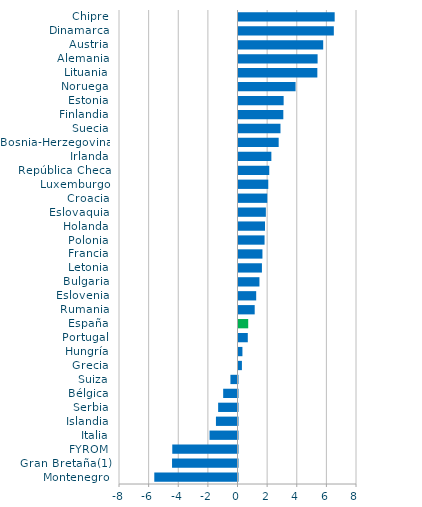
| Category | Series 0 |
|---|---|
| Montenegro | -5.617 |
| Gran Bretaña(1) | -4.419 |
| FYROM | -4.404 |
| Italia | -1.887 |
| Islandia | -1.456 |
| Serbia | -1.307 |
| Bélgica | -0.967 |
| Suiza | -0.478 |
| Grecia | 0.231 |
| Hungría | 0.265 |
| Portugal | 0.627 |
| España | 0.656 |
| Rumania | 1.093 |
| Eslovenia | 1.194 |
| Bulgaria | 1.414 |
| Letonia | 1.581 |
| Francia | 1.616 |
| Polonia | 1.759 |
| Holanda | 1.791 |
| Eslovaquia | 1.847 |
| Croacia | 1.943 |
| Luxemburgo | 2.01 |
| República Checa | 2.077 |
| Irlanda | 2.218 |
| Bosnia-Herzegovina | 2.712 |
| Suecia | 2.834 |
| Finlandia | 3.026 |
| Estonia | 3.047 |
| Noruega | 3.853 |
| Lituania | 5.323 |
| Alemania | 5.34 |
| Austria | 5.718 |
| Dinamarca | 6.435 |
| Chipre | 6.493 |